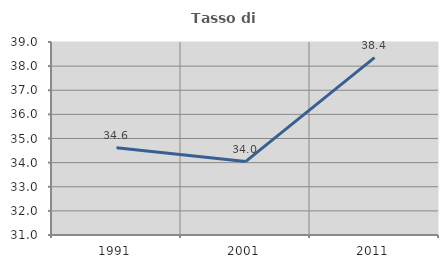
| Category | Tasso di occupazione   |
|---|---|
| 1991.0 | 34.618 |
| 2001.0 | 34.043 |
| 2011.0 | 38.351 |